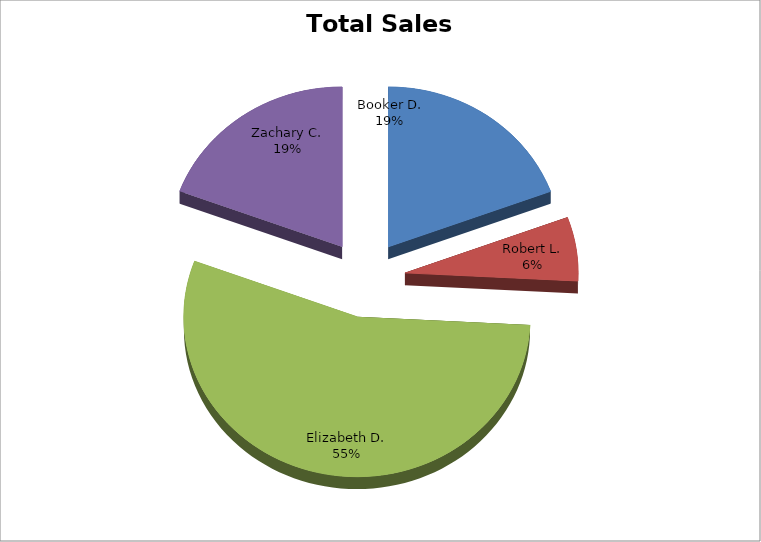
| Category | Quantity |
|---|---|
| Booker D. | 12 |
| Robert L. | 4 |
| Elizabeth D. | 34 |
| Zachary C. | 12 |